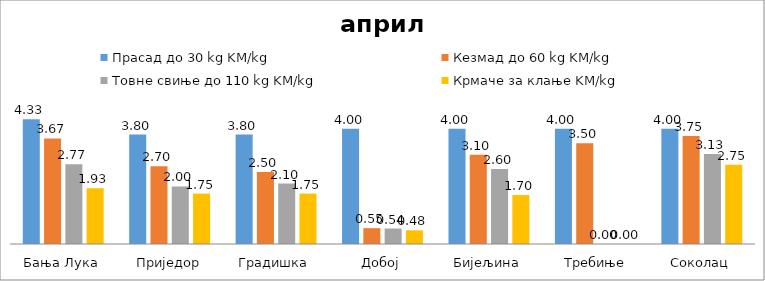
| Category | Прасад до 30 kg KM/kg | Кезмад до 60 kg KM/kg | Товне свиње до 110 kg KM/kg | Крмаче за клање KM/kg |
|---|---|---|---|---|
| Бања Лука | 4.333 | 3.667 | 2.767 | 1.933 |
| Приједор | 3.8 | 2.7 | 2 | 1.75 |
| Градишка | 3.8 | 2.5 | 2.1 | 1.75 |
| Добој | 4 | 0.55 | 0.538 | 0.475 |
| Бијељина | 4 | 3.1 | 2.6 | 1.7 |
|  Требиње | 4 | 3.5 | 0 | 0 |
| Соколац | 4 | 3.75 | 3.125 | 2.75 |